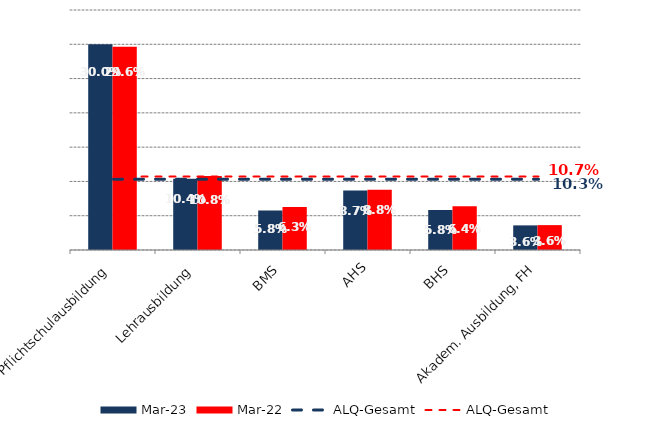
| Category | Mrz 23 | Mrz 22 |
|---|---|---|
| Pflichtschulausbildung | 0.3 | 0.296 |
| Lehrausbildung | 0.104 | 0.108 |
| BMS | 0.058 | 0.063 |
| AHS | 0.087 | 0.088 |
| BHS | 0.058 | 0.064 |
| Akadem. Ausbildung, FH | 0.036 | 0.036 |